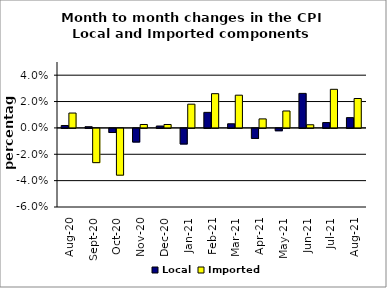
| Category | Local | Imported |
|---|---|---|
| 2020-08-01 | 0.002 | 0.011 |
| 2020-09-01 | 0.001 | -0.026 |
| 2020-10-01 | -0.003 | -0.035 |
| 2020-11-01 | -0.01 | 0.003 |
| 2020-12-01 | 0.001 | 0.003 |
| 2021-01-01 | -0.012 | 0.018 |
| 2021-02-01 | 0.012 | 0.026 |
| 2021-03-01 | 0.003 | 0.025 |
| 2021-04-01 | -0.008 | 0.007 |
| 2021-05-01 | -0.002 | 0.013 |
| 2021-06-01 | 0.026 | 0.002 |
| 2021-07-01 | 0.004 | 0.029 |
| 2021-08-01 | 0.008 | 0.022 |